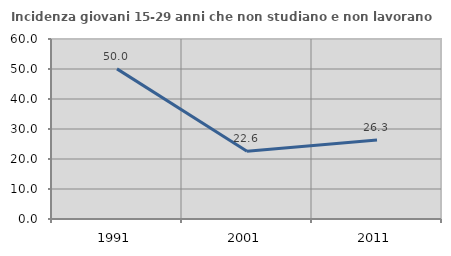
| Category | Incidenza giovani 15-29 anni che non studiano e non lavorano  |
|---|---|
| 1991.0 | 50.045 |
| 2001.0 | 22.581 |
| 2011.0 | 26.316 |